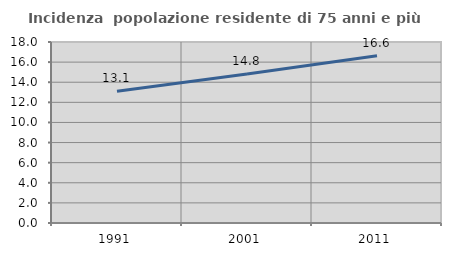
| Category | Incidenza  popolazione residente di 75 anni e più |
|---|---|
| 1991.0 | 13.092 |
| 2001.0 | 14.827 |
| 2011.0 | 16.632 |